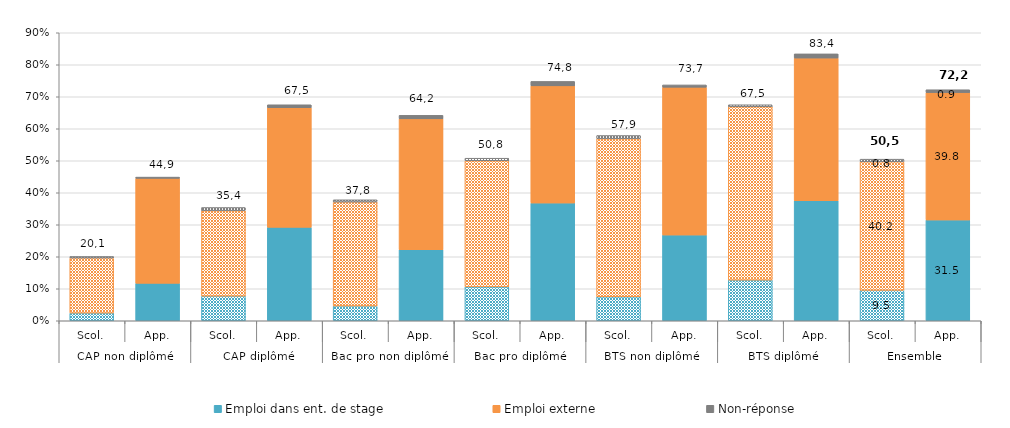
| Category | Emploi dans ent. de stage | Emploi externe | Non-réponse |
|---|---|---|---|
| 0 | 2.4 | 17.2 | 0.5 |
| 1 | 11.7 | 32.8 | 0.4 |
| 2 | 7.7 | 26.7 | 1 |
| 3 | 29.2 | 37.4 | 0.9 |
| 4 | 4.6 | 32.5 | 0.7 |
| 5 | 22.2 | 40.9 | 1.1 |
| 6 | 10.6 | 39.4 | 0.8 |
| 7 | 36.8 | 36.6 | 1.4 |
| 8 | 7.5 | 49.4 | 1 |
| 9 | 26.8 | 46.2 | 0.7 |
| 10 | 12.7 | 54.2 | 0.6 |
| 11 | 37.5 | 44.6 | 1.3 |
| 12 | 9.5 | 40.2 | 0.8 |
| 13 | 31.5 | 39.8 | 0.9 |